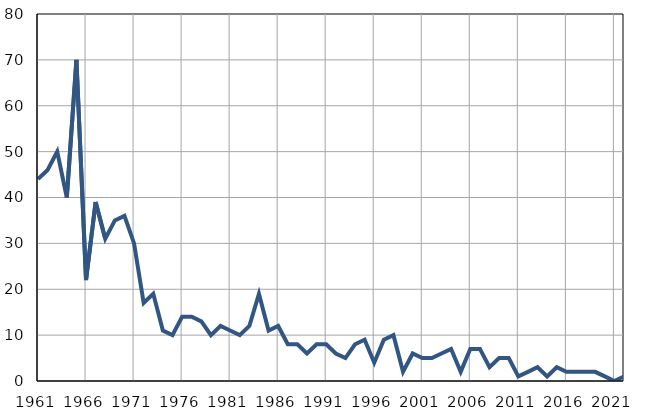
| Category | Infants
deaths |
|---|---|
| 1961.0 | 44 |
| 1962.0 | 46 |
| 1963.0 | 50 |
| 1964.0 | 40 |
| 1965.0 | 70 |
| 1966.0 | 22 |
| 1967.0 | 39 |
| 1968.0 | 31 |
| 1969.0 | 35 |
| 1970.0 | 36 |
| 1971.0 | 30 |
| 1972.0 | 17 |
| 1973.0 | 19 |
| 1974.0 | 11 |
| 1975.0 | 10 |
| 1976.0 | 14 |
| 1977.0 | 14 |
| 1978.0 | 13 |
| 1979.0 | 10 |
| 1980.0 | 12 |
| 1981.0 | 11 |
| 1982.0 | 10 |
| 1983.0 | 12 |
| 1984.0 | 19 |
| 1985.0 | 11 |
| 1986.0 | 12 |
| 1987.0 | 8 |
| 1988.0 | 8 |
| 1989.0 | 6 |
| 1990.0 | 8 |
| 1991.0 | 8 |
| 1992.0 | 6 |
| 1993.0 | 5 |
| 1994.0 | 8 |
| 1995.0 | 9 |
| 1996.0 | 4 |
| 1997.0 | 9 |
| 1998.0 | 10 |
| 1999.0 | 2 |
| 2000.0 | 6 |
| 2001.0 | 5 |
| 2002.0 | 5 |
| 2003.0 | 6 |
| 2004.0 | 7 |
| 2005.0 | 2 |
| 2006.0 | 7 |
| 2007.0 | 7 |
| 2008.0 | 3 |
| 2009.0 | 5 |
| 2010.0 | 5 |
| 2011.0 | 1 |
| 2012.0 | 2 |
| 2013.0 | 3 |
| 2014.0 | 1 |
| 2015.0 | 3 |
| 2016.0 | 2 |
| 2017.0 | 2 |
| 2018.0 | 2 |
| 2019.0 | 2 |
| 2020.0 | 1 |
| 2021.0 | 0 |
| 2022.0 | 1 |